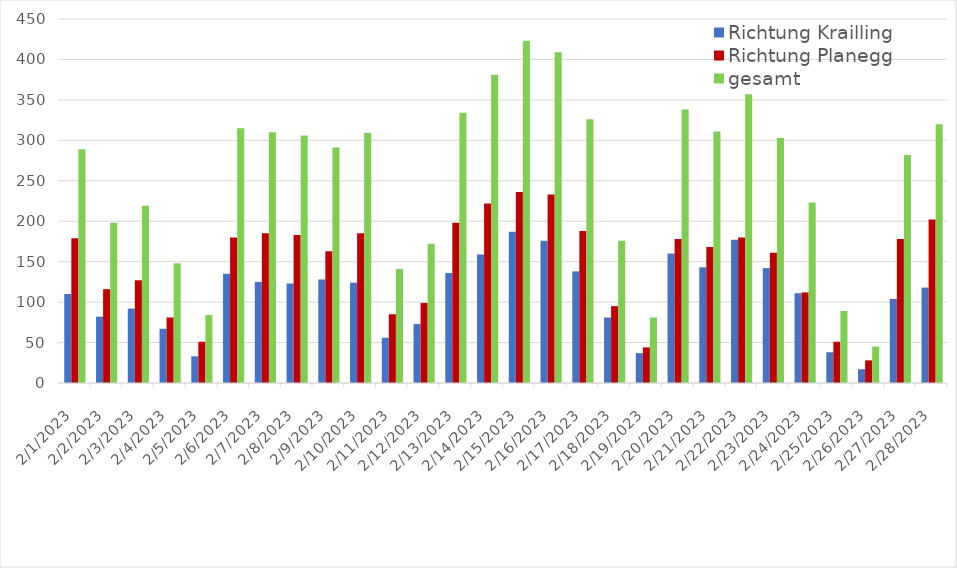
| Category | Richtung Krailling | Richtung Planegg | gesamt |
|---|---|---|---|
| 2/1/23 | 110 | 179 | 289 |
| 2/2/23 | 82 | 116 | 198 |
| 2/3/23 | 92 | 127 | 219 |
| 2/4/23 | 67 | 81 | 148 |
| 2/5/23 | 33 | 51 | 84 |
| 2/6/23 | 135 | 180 | 315 |
| 2/7/23 | 125 | 185 | 310 |
| 2/8/23 | 123 | 183 | 306 |
| 2/9/23 | 128 | 163 | 291 |
| 2/10/23 | 124 | 185 | 309 |
| 2/11/23 | 56 | 85 | 141 |
| 2/12/23 | 73 | 99 | 172 |
| 2/13/23 | 136 | 198 | 334 |
| 2/14/23 | 159 | 222 | 381 |
| 2/15/23 | 187 | 236 | 423 |
| 2/16/23 | 176 | 233 | 409 |
| 2/17/23 | 138 | 188 | 326 |
| 2/18/23 | 81 | 95 | 176 |
| 2/19/23 | 37 | 44 | 81 |
| 2/20/23 | 160 | 178 | 338 |
| 2/21/23 | 143 | 168 | 311 |
| 2/22/23 | 177 | 180 | 357 |
| 2/23/23 | 142 | 161 | 303 |
| 2/24/23 | 111 | 112 | 223 |
| 2/25/23 | 38 | 51 | 89 |
| 2/26/23 | 17 | 28 | 45 |
| 2/27/23 | 104 | 178 | 282 |
| 2/28/23 | 118 | 202 | 320 |